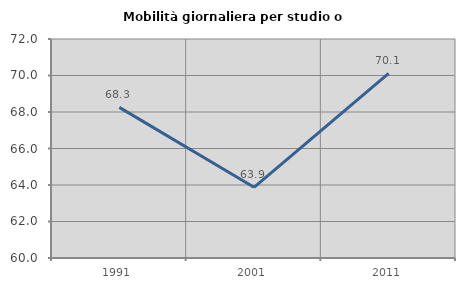
| Category | Mobilità giornaliera per studio o lavoro |
|---|---|
| 1991.0 | 68.253 |
| 2001.0 | 63.874 |
| 2011.0 | 70.111 |